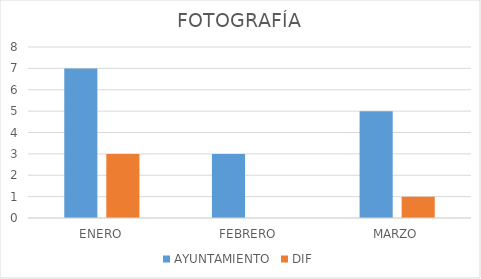
| Category | AYUNTAMIENTO | DIF |
|---|---|---|
| ENERO | 7 | 3 |
| FEBRERO | 3 | 0 |
| MARZO | 5 | 1 |